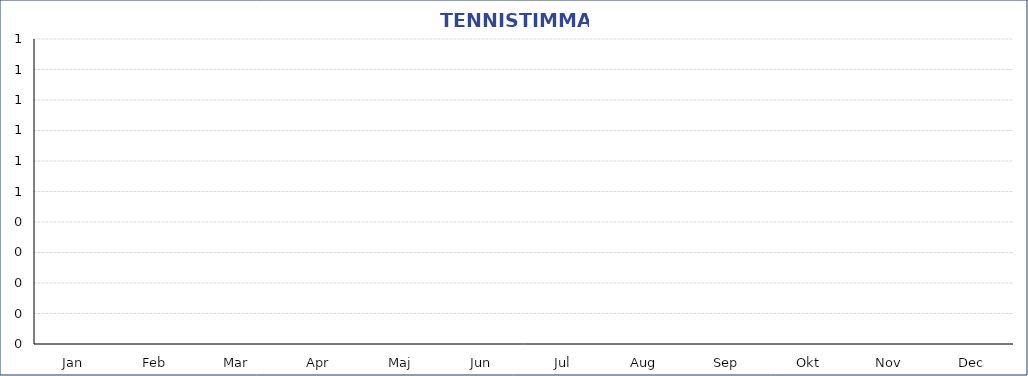
| Category | 2020 | 2021 | 2022 | Series 3 |
|---|---|---|---|---|
| Jan | 0 | 0 | 0 | 0 |
| Feb | 0 | 0 | 0 | 0 |
| Mar | 0 | 0 | 0 | 0 |
| Apr | 0 | 0 | 0 | 0 |
| Maj | 0 | 0 | 0 | 0 |
| Jun | 0 | 0 | 0 | 0 |
| Jul | 0 | 0 | 0 | 0 |
| Aug | 0 | 0 | 0 | 0 |
| Sep | 0 | 0 | 0 | 0 |
| Okt | 0 | 0 | 0 | 0 |
| Nov | 0 | 0 | 0 | 0 |
| Dec | 0 | 0 | 0 | 0 |